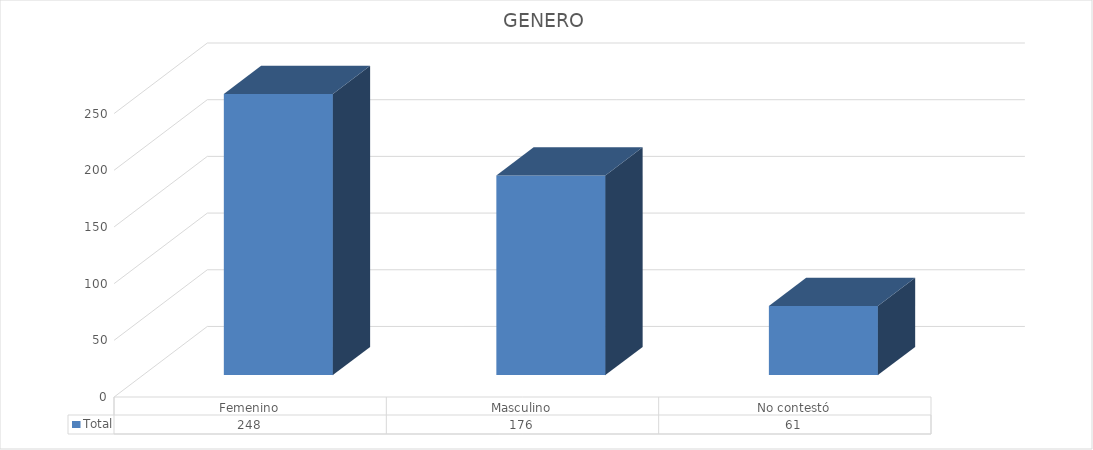
| Category | Total |
|---|---|
| Femenino | 248 |
| Masculino | 176 |
| No contestó | 61 |